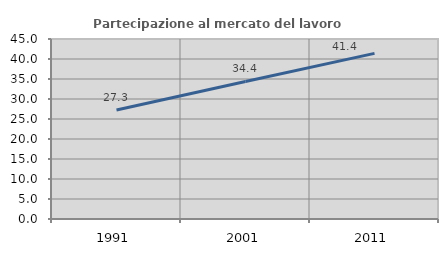
| Category | Partecipazione al mercato del lavoro  femminile |
|---|---|
| 1991.0 | 27.253 |
| 2001.0 | 34.389 |
| 2011.0 | 41.412 |